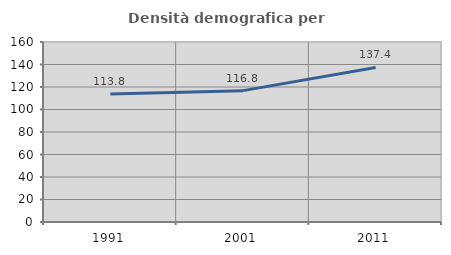
| Category | Densità demografica |
|---|---|
| 1991.0 | 113.768 |
| 2001.0 | 116.766 |
| 2011.0 | 137.354 |